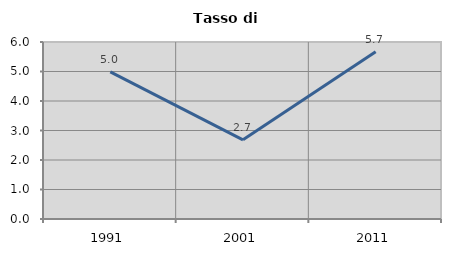
| Category | Tasso di disoccupazione   |
|---|---|
| 1991.0 | 4.987 |
| 2001.0 | 2.683 |
| 2011.0 | 5.666 |